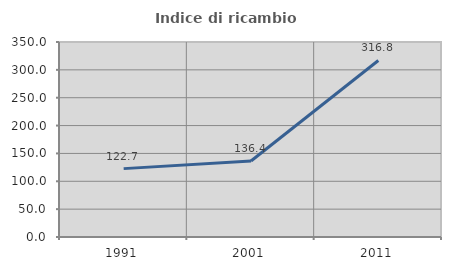
| Category | Indice di ricambio occupazionale  |
|---|---|
| 1991.0 | 122.727 |
| 2001.0 | 136.364 |
| 2011.0 | 316.822 |